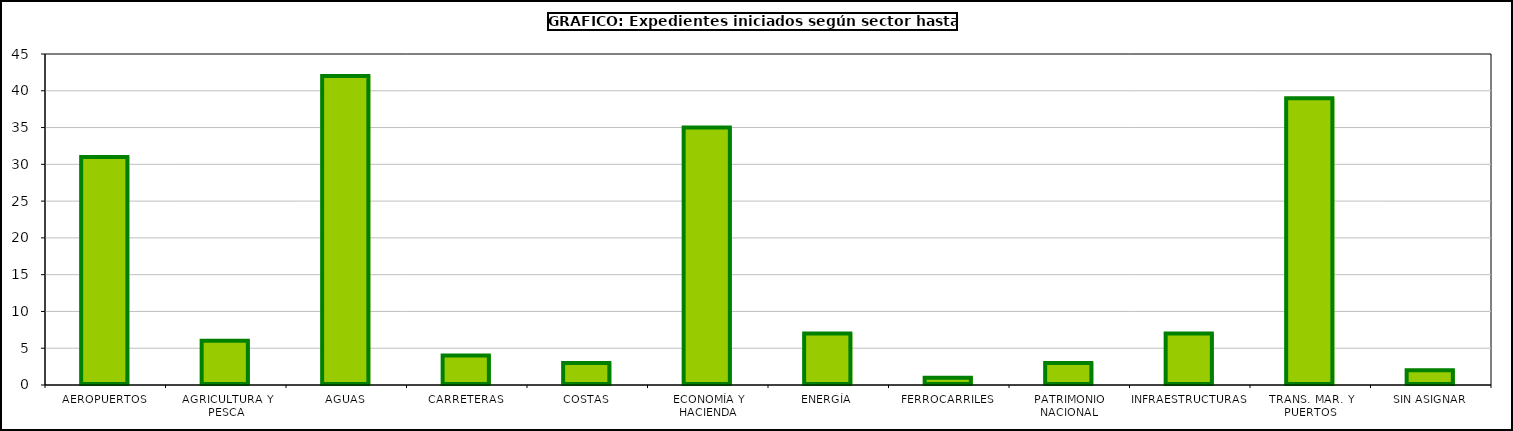
| Category | Series 0 |
|---|---|
| AEROPUERTOS | 31 |
| AGRICULTURA Y PESCA | 6 |
| AGUAS | 42 |
| CARRETERAS | 4 |
| COSTAS | 3 |
| ECONOMÍA Y HACIENDA | 35 |
| ENERGÍA | 7 |
| FERROCARRILES | 1 |
| PATRIMONIO NACIONAL | 3 |
| INFRAESTRUCTURAS | 7 |
| TRANS. MAR. Y PUERTOS | 39 |
| SIN ASIGNAR | 2 |